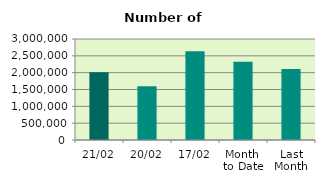
| Category | Series 0 |
|---|---|
| 21/02 | 2014842 |
| 20/02 | 1596322 |
| 17/02 | 2638626 |
| Month 
to Date | 2321826.533 |
| Last
Month | 2107310.455 |